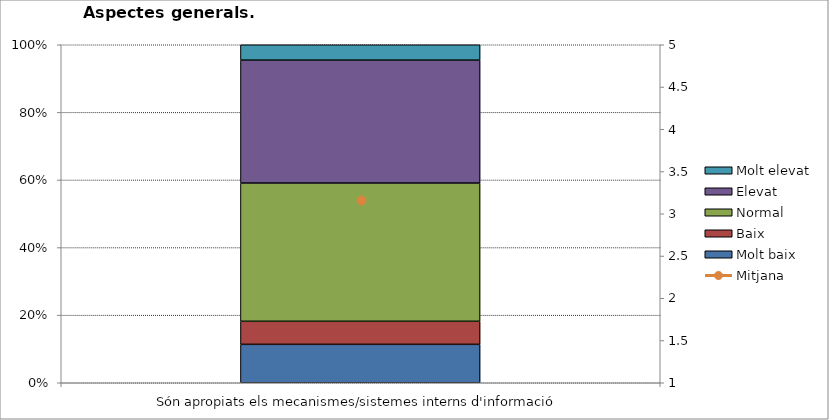
| Category | Molt baix | Baix | Normal  | Elevat | Molt elevat |
|---|---|---|---|---|---|
| Són apropiats els mecanismes/sistemes interns d'informació | 5 | 3 | 18 | 16 | 2 |